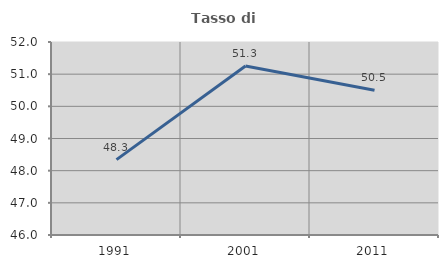
| Category | Tasso di occupazione   |
|---|---|
| 1991.0 | 48.343 |
| 2001.0 | 51.255 |
| 2011.0 | 50.499 |